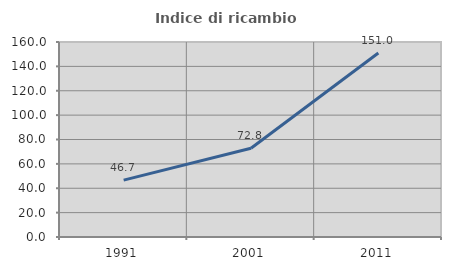
| Category | Indice di ricambio occupazionale  |
|---|---|
| 1991.0 | 46.701 |
| 2001.0 | 72.797 |
| 2011.0 | 150.996 |